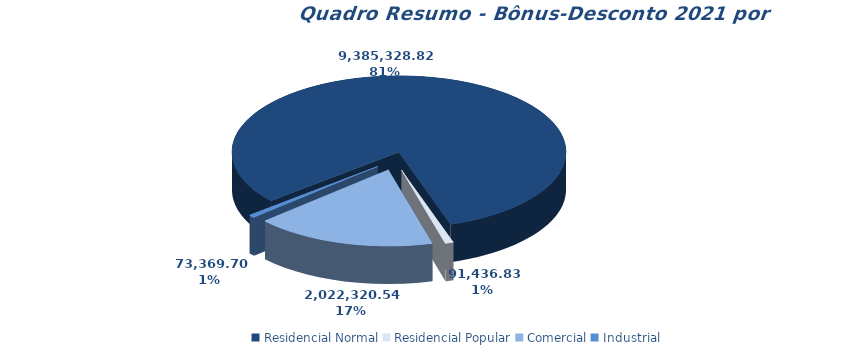
| Category | Quadro Resumo - Bônus-Desconto |
|---|---|
| Residencial Normal | 9385328.816 |
| Residencial Popular | 91436.83 |
| Comercial | 2022320.544 |
| Industrial | 73369.704 |